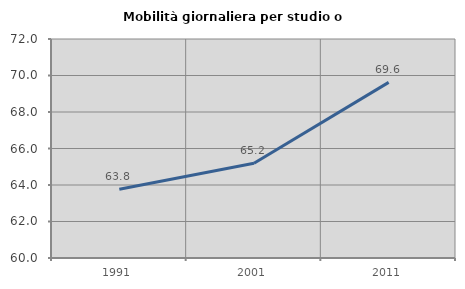
| Category | Mobilità giornaliera per studio o lavoro |
|---|---|
| 1991.0 | 63.769 |
| 2001.0 | 65.19 |
| 2011.0 | 69.624 |